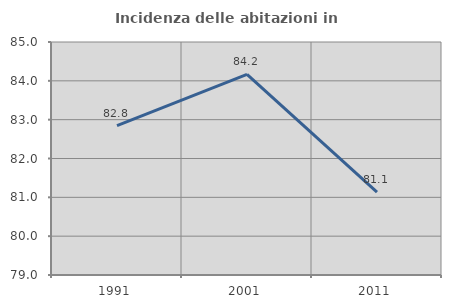
| Category | Incidenza delle abitazioni in proprietà  |
|---|---|
| 1991.0 | 82.848 |
| 2001.0 | 84.165 |
| 2011.0 | 81.132 |